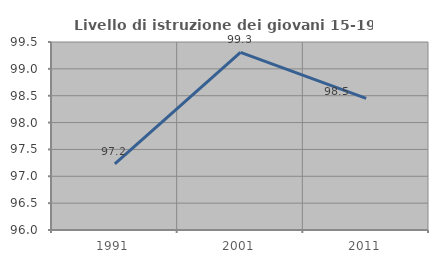
| Category | Livello di istruzione dei giovani 15-19 anni |
|---|---|
| 1991.0 | 97.23 |
| 2001.0 | 99.308 |
| 2011.0 | 98.452 |